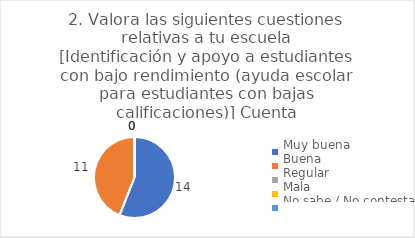
| Category | 2. Valora las siguientes cuestiones relativas a tu escuela
[Identificación y apoyo a estudiantes con bajo rendimiento (ayuda escolar para estudiantes con bajas calificaciones)] |
|---|---|
| Muy buena  | 0.56 |
| Buena  | 0.44 |
| Regular  | 0 |
| Mala  | 0 |
| No sabe / No contesta | 0 |